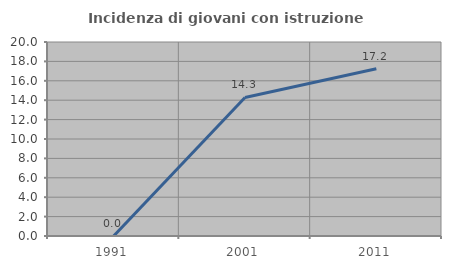
| Category | Incidenza di giovani con istruzione universitaria |
|---|---|
| 1991.0 | 0 |
| 2001.0 | 14.286 |
| 2011.0 | 17.241 |